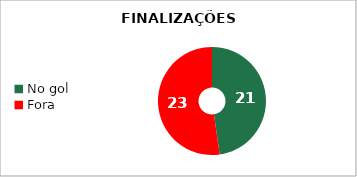
| Category | Series 1 |
|---|---|
| No gol | 21 |
| Fora | 23 |